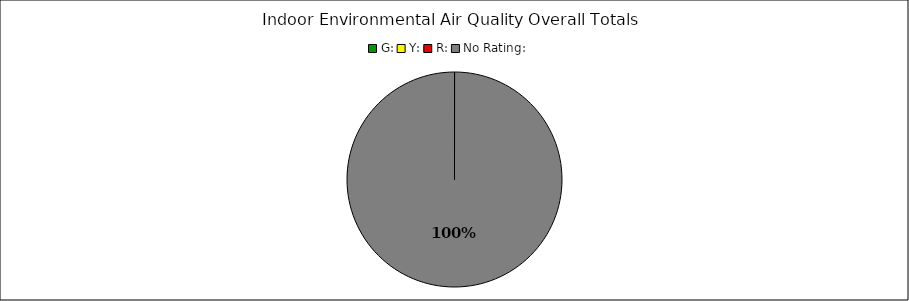
| Category | Series 0 |
|---|---|
| G: | 0 |
| Y: | 0 |
| R: | 0 |
| No Rating: | 9 |